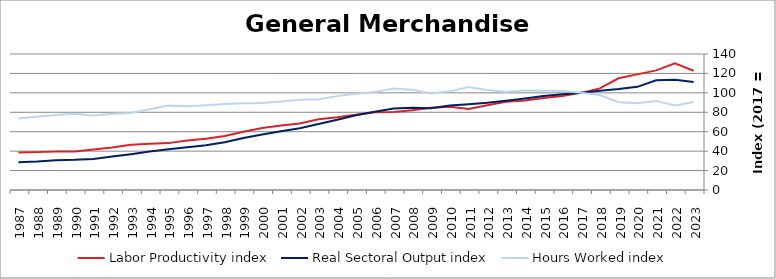
| Category | Labor Productivity index | Real Sectoral Output index | Hours Worked index |
|---|---|---|---|
| 2023.0 | 122.768 | 111.149 | 90.535 |
| 2022.0 | 130.42 | 113.398 | 86.949 |
| 2021.0 | 123.158 | 112.974 | 91.73 |
| 2020.0 | 119.011 | 106.206 | 89.24 |
| 2019.0 | 115.032 | 103.918 | 90.338 |
| 2018.0 | 104.596 | 102.284 | 97.79 |
| 2017.0 | 100 | 100 | 100 |
| 2016.0 | 96.682 | 98.615 | 102 |
| 2015.0 | 94.686 | 96.733 | 102.162 |
| 2014.0 | 92.06 | 94.199 | 102.323 |
| 2013.0 | 90.733 | 91.801 | 101.177 |
| 2012.0 | 87.182 | 89.787 | 102.988 |
| 2011.0 | 83.29 | 88.363 | 106.091 |
| 2010.0 | 85.579 | 86.895 | 101.538 |
| 2009.0 | 84.698 | 84.098 | 99.291 |
| 2008.0 | 82.179 | 84.781 | 103.166 |
| 2007.0 | 80.323 | 83.88 | 104.43 |
| 2006.0 | 79.93 | 80.54 | 100.763 |
| 2005.0 | 77.558 | 76.865 | 99.106 |
| 2004.0 | 74.82 | 72.305 | 96.639 |
| 2003.0 | 72.73 | 68.031 | 93.539 |
| 2002.0 | 68.565 | 63.663 | 92.851 |
| 2001.0 | 66.323 | 60.478 | 91.188 |
| 2000.0 | 63.71 | 57.077 | 89.589 |
| 1999.0 | 60.019 | 53.595 | 89.297 |
| 1998.0 | 55.679 | 49.237 | 88.43 |
| 1997.0 | 52.772 | 46.021 | 87.207 |
| 1996.0 | 50.932 | 43.959 | 86.309 |
| 1995.0 | 48.259 | 41.936 | 86.898 |
| 1994.0 | 47.629 | 39.573 | 83.086 |
| 1993.0 | 46.486 | 36.832 | 79.232 |
| 1992.0 | 43.752 | 34.38 | 78.579 |
| 1991.0 | 41.698 | 31.949 | 76.62 |
| 1990.0 | 39.55 | 31.077 | 78.578 |
| 1989.0 | 39.697 | 30.695 | 77.323 |
| 1988.0 | 38.989 | 29.413 | 75.44 |
| 1987.0 | 38.634 | 28.58 | 73.976 |